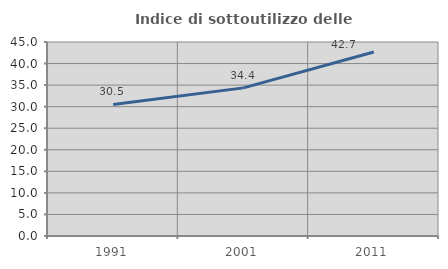
| Category | Indice di sottoutilizzo delle abitazioni  |
|---|---|
| 1991.0 | 30.524 |
| 2001.0 | 34.358 |
| 2011.0 | 42.685 |